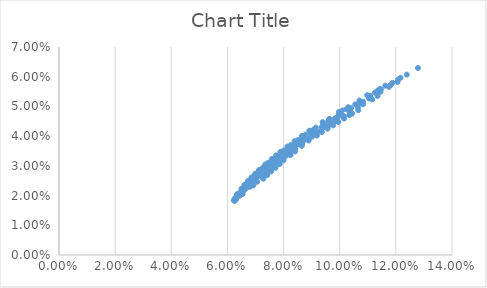
| Category | Series 0 |
|---|---|
| 0.06264918085142597 | 0.018 |
| 0.06478872440676925 | 0.021 |
| 0.0680217669149566 | 0.024 |
| 0.07065391655545286 | 0.026 |
| 0.07346295235002155 | 0.029 |
| 0.07661245209893282 | 0.031 |
| 0.0797231158914645 | 0.034 |
| 0.08388066216946105 | 0.037 |
| 0.08745123249335289 | 0.039 |
| 0.09091862267926232 | 0.041 |
| 0.09446950898647724 | 0.044 |
| 0.09932724637722587 | 0.047 |
| 0.10303664519298347 | 0.049 |
| 0.1070195111750243 | 0.051 |
| 0.11083908200341498 | 0.053 |
| 0.1147050248225542 | 0.056 |
| 0.11883313807384874 | 0.058 |
| 0.12388240628440922 | 0.061 |
| 0.1278708790204143 | 0.063 |
| 0.06540806153059354 | 0.021 |
| 0.06798241566294008 | 0.023 |
| 0.06983191182506308 | 0.025 |
| 0.0727600809624326 | 0.027 |
| 0.07483379246765613 | 0.029 |
| 0.0778534942701311 | 0.032 |
| 0.08120654433870912 | 0.034 |
| 0.08355049993551687 | 0.036 |
| 0.08690322261503074 | 0.038 |
| 0.0905610798030372 | 0.041 |
| 0.0940971369594782 | 0.043 |
| 0.09690658736273665 | 0.045 |
| 0.10078831306872757 | 0.047 |
| 0.10368851975712605 | 0.049 |
| 0.10768148009102675 | 0.051 |
| 0.11043126577872082 | 0.053 |
| 0.11451286230375302 | 0.055 |
| 0.11754722368299317 | 0.057 |
| 0.12060446946194875 | 0.058 |
| 0.06926026360758053 | 0.023 |
| 0.07057611259471622 | 0.025 |
| 0.07273302439906237 | 0.026 |
| 0.07478448883558823 | 0.028 |
| 0.07712329764991949 | 0.03 |
| 0.0793349483581374 | 0.032 |
| 0.0818260068788125 | 0.034 |
| 0.0841720289095274 | 0.036 |
| 0.08657670329527264 | 0.037 |
| 0.0902240958324097 | 0.04 |
| 0.0929663726128882 | 0.042 |
| 0.09575510169624457 | 0.043 |
| 0.09858634114802664 | 0.045 |
| 0.10145653215584134 | 0.047 |
| 0.10354237184818055 | 0.048 |
| 0.1064715967368567 | 0.05 |
| 0.10836457816133839 | 0.051 |
| 0.11157724974483092 | 0.052 |
| 0.11350081278683644 | 0.053 |
| 0.07275186268781565 | 0.026 |
| 0.07416497116640539 | 0.027 |
| 0.07561749761081628 | 0.028 |
| 0.07710721441584442 | 0.029 |
| 0.07863200784833933 | 0.031 |
| 0.07997131722271004 | 0.032 |
| 0.08247389419122736 | 0.034 |
| 0.0841058174700963 | 0.035 |
| 0.08649244737997434 | 0.037 |
| 0.08893401165447694 | 0.039 |
| 0.09187536362520293 | 0.04 |
| 0.09363831877881759 | 0.041 |
| 0.09565079029041897 | 0.043 |
| 0.09768531976589788 | 0.044 |
| 0.09950469376615545 | 0.045 |
| 0.10157666772059787 | 0.046 |
| 0.10342830191106882 | 0.047 |
| 0.1044788200462126 | 0.048 |
| 0.10659245305684899 | 0.049 |
| 0.06328455015127528 | 0.02 |
| 0.06551299335698002 | 0.022 |
| 0.06711829821528906 | 0.024 |
| 0.06911300338606519 | 0.026 |
| 0.07030746918939312 | 0.027 |
| 0.0716906166835494 | 0.028 |
| 0.07311567814332899 | 0.03 |
| 0.07442582558561664 | 0.031 |
| 0.07592459318100113 | 0.032 |
| 0.07745861965295733 | 0.033 |
| 0.08006896357143485 | 0.035 |
| 0.08259124960530308 | 0.037 |
| 0.08517936482132515 | 0.039 |
| 0.08782748981611928 | 0.041 |
| 0.09150509830866936 | 0.043 |
| 0.09627564765978518 | 0.046 |
| 0.10096934697937725 | 0.049 |
| 0.10701604915504849 | 0.052 |
| 0.11622038129553318 | 0.057 |
| 0.06528656680801184 | 0.021 |
| 0.06700417237520043 | 0.023 |
| 0.06883271373054124 | 0.025 |
| 0.07092352737612671 | 0.027 |
| 0.07232046567339423 | 0.028 |
| 0.07375843238709802 | 0.029 |
| 0.07523507502773372 | 0.031 |
| 0.07674816124114246 | 0.032 |
| 0.07917063475108001 | 0.034 |
| 0.08076694509417927 | 0.035 |
| 0.08423306952133178 | 0.037 |
| 0.08666949587518655 | 0.039 |
| 0.09031971679946657 | 0.041 |
| 0.09406285200124878 | 0.044 |
| 0.09972545854281308 | 0.047 |
| 0.10553790987455004 | 0.051 |
| 0.11254936132071414 | 0.055 |
| 0.12167875010140727 | 0.06 |
| 0.06309237643493751 | 0.019 |
| 0.06609851012367429 | 0.022 |
| 0.0678608597565846 | 0.024 |
| 0.06989483546925443 | 0.026 |
| 0.07203758643710007 | 0.027 |
| 0.07346295235002155 | 0.029 |
| 0.07492763475194925 | 0.03 |
| 0.07661245209893282 | 0.031 |
| 0.07815142177469975 | 0.032 |
| 0.0797231158914645 | 0.034 |
| 0.08132563717993126 | 0.035 |
| 0.08388066216946105 | 0.037 |
| 0.08649858845836668 | 0.038 |
| 0.0899422338868834 | 0.041 |
| 0.09367762359026587 | 0.043 |
| 0.09830405470876866 | 0.046 |
| 0.10408047596027993 | 0.049 |
| 0.11083908200341498 | 0.053 |
| 0.12080168542568982 | 0.059 |
| 0.06445222919304339 | 0.02 |
| 0.06763998598061402 | 0.023 |
| 0.06965549741425647 | 0.025 |
| 0.07196416269977397 | 0.027 |
| 0.07419649326654773 | 0.029 |
| 0.07586621125753064 | 0.03 |
| 0.07652014511919994 | 0.03 |
| 0.07824945877231584 | 0.031 |
| 0.07981411251813614 | 0.033 |
| 0.08071064168860043 | 0.033 |
| 0.08232202099639821 | 0.035 |
| 0.08396175422963896 | 0.036 |
| 0.08657670329527264 | 0.037 |
| 0.08903527789548112 | 0.039 |
| 0.09175733317196076 | 0.041 |
| 0.09632616723206752 | 0.044 |
| 0.10078831306872757 | 0.047 |
| 0.10829842592534476 | 0.052 |
| 0.0625817135590805 | 0.019 |
| 0.06339036375767178 | 0.02 |
| 0.06499684455428657 | 0.022 |
| 0.06605361829664223 | 0.024 |
| 0.0672818699553205 | 0.025 |
| 0.06856072587518244 | 0.026 |
| 0.06988740811920467 | 0.027 |
| 0.07125924549102196 | 0.029 |
| 0.0734682276966934 | 0.03 |
| 0.07577080565675588 | 0.032 |
| 0.07730190306804419 | 0.033 |
| 0.0788663871319704 | 0.035 |
| 0.08135269525199883 | 0.037 |
| 0.0839079801110511 | 0.038 |
| 0.08652613087331307 | 0.04 |
| 0.08920161219132798 | 0.042 |
| 0.09389787666278872 | 0.045 |
| 0.0997471782766945 | 0.048 |
| 0.06226038581907203 | 0.018 |
| 0.06423893953610092 | 0.021 |
| 0.06524613988296842 | 0.022 |
| 0.06711829821528906 | 0.024 |
| 0.06824731740641779 | 0.025 |
| 0.06956082180059446 | 0.027 |
| 0.07092018823449969 | 0.028 |
| 0.07232283071133751 | 0.029 |
| 0.07392100653669696 | 0.03 |
| 0.07624316356478374 | 0.032 |
| 0.07778279540331837 | 0.033 |
| 0.07935527773490374 | 0.035 |
| 0.08185770815192513 | 0.036 |
| 0.08442773690811001 | 0.038 |
| 0.08705937761666736 | 0.04 |
| 0.0907174851800611 | 0.042 |
| 0.09627564765978518 | 0.046 |
| 0.10303612522844777 | 0.05 |
| 0.11427215636397643 | 0.056 |
| 0.06295787862251487 | 0.019 |
| 0.06500258653083893 | 0.021 |
| 0.06685560798905593 | 0.023 |
| 0.06796164066808975 | 0.025 |
| 0.06926132480694853 | 0.026 |
| 0.0706075859874121 | 0.027 |
| 0.07215721887672144 | 0.028 |
| 0.0735920929736003 | 0.03 |
| 0.07506584865095499 | 0.031 |
| 0.07657624104369598 | 0.032 |
| 0.07812114518053034 | 0.033 |
| 0.07969855412423651 | 0.034 |
| 0.08239273636701558 | 0.036 |
| 0.08404629775001388 | 0.037 |
| 0.08666949587518655 | 0.039 |
| 0.09012592276563985 | 0.042 |
| 0.09586473394345478 | 0.045 |
| 0.1024072587215536 | 0.049 |
| 0.11340922992809252 | 0.055 |
| 0.06430396102063596 | 0.02 |
| 0.06662164627463031 | 0.023 |
| 0.06858019240615192 | 0.024 |
| 0.06989483546925443 | 0.026 |
| 0.07125508285957277 | 0.027 |
| 0.07283298122981223 | 0.028 |
| 0.07346295235002155 | 0.029 |
| 0.07492763475194925 | 0.03 |
| 0.07661245209893282 | 0.031 |
| 0.07815142177469975 | 0.032 |
| 0.0797231158914645 | 0.034 |
| 0.0804259414850969 | 0.034 |
| 0.08223435249614891 | 0.035 |
| 0.08481235965067273 | 0.037 |
| 0.08649858845836668 | 0.038 |
| 0.0899422338868834 | 0.041 |
| 0.09367762359026587 | 0.043 |
| 0.10014287517556114 | 0.047 |
| 0.11083908200341498 | 0.053 |
| 0.06309237643493751 | 0.019 |
| 0.11818671522668839 | 0.057 |
| 0.10977842438727446 | 0.054 |